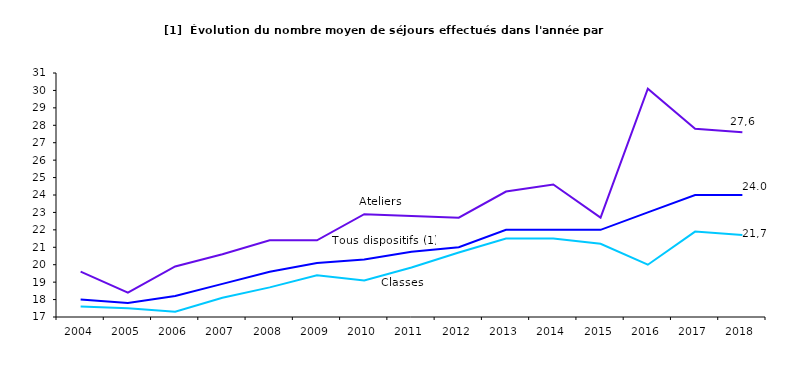
| Category | Ateliers | Classes | Tous dispositifs |
|---|---|---|---|
| 2004.0 | 19.6 | 17.6 | 18 |
| 2005.0 | 18.4 | 17.5 | 17.8 |
| 2006.0 | 19.9 | 17.3 | 18.2 |
| 2007.0 | 20.6 | 18.1 | 18.9 |
| 2008.0 | 21.4 | 18.7 | 19.6 |
| 2009.0 | 21.4 | 19.4 | 20.1 |
| 2010.0 | 22.9 | 19.1 | 20.3 |
| 2011.0 | 22.802 | 19.844 | 20.738 |
| 2012.0 | 22.7 | 20.7 | 21 |
| 2013.0 | 24.2 | 21.5 | 22 |
| 2014.0 | 24.6 | 21.5 | 22 |
| 2015.0 | 22.7 | 21.2 | 22 |
| 2016.0 | 30.1 | 20 | 23 |
| 2017.0 | 27.8 | 21.9 | 24 |
| 2018.0 | 27.6 | 21.7 | 24 |